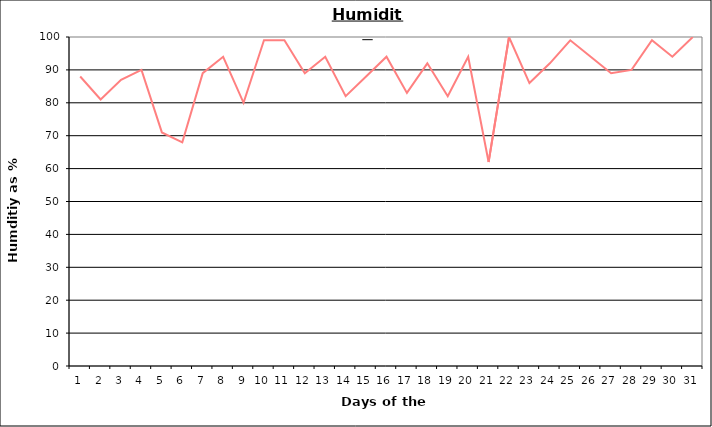
| Category | Series 0 |
|---|---|
| 0 | 88 |
| 1 | 81 |
| 2 | 87 |
| 3 | 90 |
| 4 | 71 |
| 5 | 68 |
| 6 | 89 |
| 7 | 94 |
| 8 | 80 |
| 9 | 99 |
| 10 | 99 |
| 11 | 89 |
| 12 | 94 |
| 13 | 82 |
| 14 | 88 |
| 15 | 94 |
| 16 | 83 |
| 17 | 92 |
| 18 | 82 |
| 19 | 94 |
| 20 | 62 |
| 21 | 100 |
| 22 | 86 |
| 23 | 92 |
| 24 | 99 |
| 25 | 94 |
| 26 | 89 |
| 27 | 90 |
| 28 | 99 |
| 29 | 94 |
| 30 | 100 |